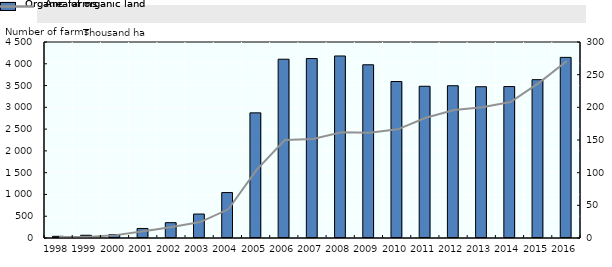
| Category | Organic farms  |
|---|---|
| 1998.0 | 39 |
| 1999.0 | 63 |
| 2000.0 | 78 |
| 2001.0 | 219 |
| 2002.0 | 352 |
| 2003.0 | 550 |
| 2004.0 | 1043 |
| 2005.0 | 2873 |
| 2006.0 | 4105 |
| 2007.0 | 4120 |
| 2008.0 | 4179 |
| 2009.0 | 3977 |
| 2010.0 | 3593 |
| 2011.0 | 3484 |
| 2012.0 | 3496 |
| 2013.0 | 3473 |
| 2014.0 | 3477 |
| 2015.0 | 3635 |
| 2016.0 | 4147 |